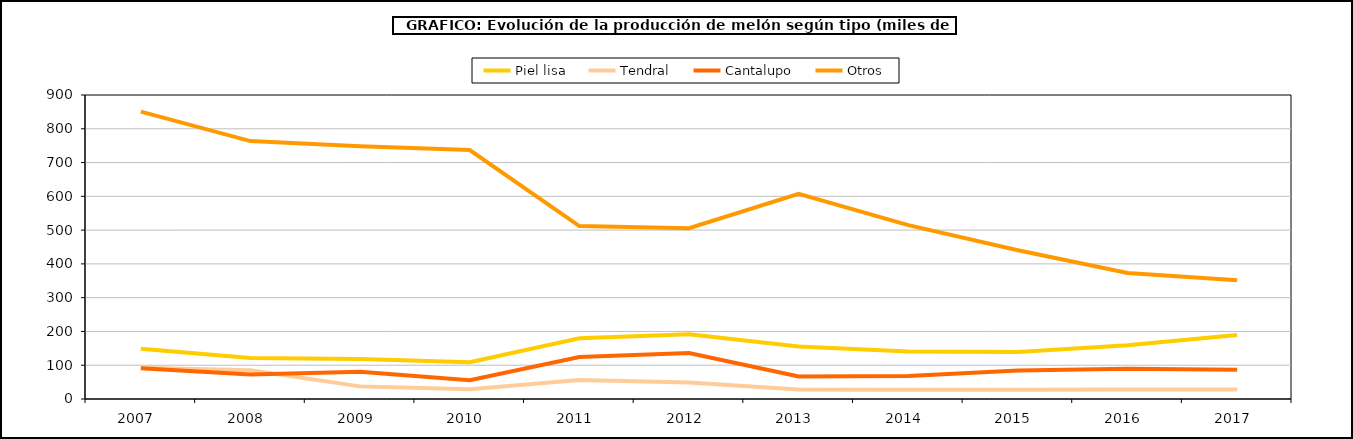
| Category | Piel lisa | Tendral | Cantalupo | Otros |
|---|---|---|---|---|
| 2007.0 | 149.064 | 92.263 | 90.873 | 850.954 |
| 2008.0 | 121.633 | 84.85 | 72.334 | 763.622 |
| 2009.0 | 118.315 | 37.372 | 81.013 | 748.086 |
| 2010.0 | 108.94 | 28.98 | 55.599 | 737.036 |
| 2011.0 | 179.519 | 56.591 | 124.015 | 511.871 |
| 2012.0 | 191.896 | 49.169 | 136.333 | 505.471 |
| 2013.0 | 155.121 | 28.073 | 66.453 | 607.304 |
| 2014.0 | 140.682 | 27.23 | 67.816 | 514.864 |
| 2015.0 | 139.486 | 27.748 | 84.305 | 440.517 |
| 2016.0 | 158.886 | 28.45 | 89.425 | 373.006 |
| 2017.0 | 189.59 | 27.88 | 86.499 | 351.708 |